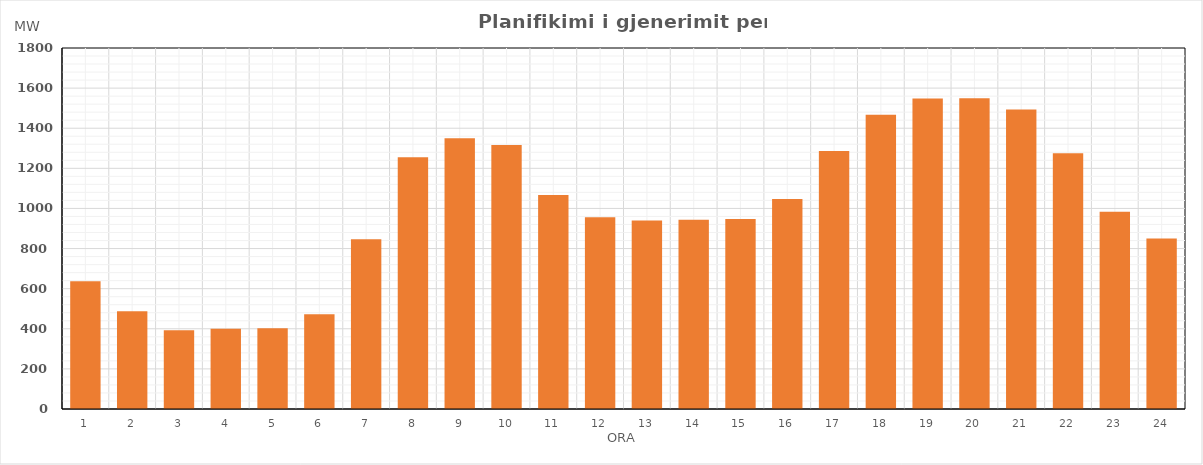
| Category | Max (MW) |
|---|---|
| 0 | 636.65 |
| 1 | 486.87 |
| 2 | 393.25 |
| 3 | 400.24 |
| 4 | 403.24 |
| 5 | 473.02 |
| 6 | 846.46 |
| 7 | 1255.82 |
| 8 | 1349.47 |
| 9 | 1316.29 |
| 10 | 1066.98 |
| 11 | 955.72 |
| 12 | 939.95 |
| 13 | 943.04 |
| 14 | 947.2 |
| 15 | 1047.27 |
| 16 | 1286.17 |
| 17 | 1467.2 |
| 18 | 1548.52 |
| 19 | 1549.43 |
| 20 | 1493.63 |
| 21 | 1274.74 |
| 22 | 983.06 |
| 23 | 850.66 |